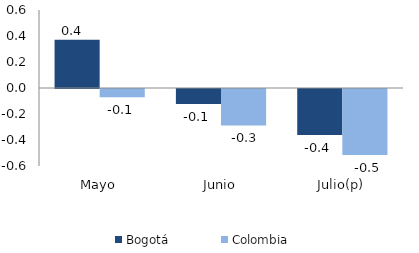
| Category | Bogotá | Colombia |
|---|---|---|
| Mayo | 0.371 | -0.063 |
| Junio | -0.116 | -0.28 |
| Julio(p) | -0.353 | -0.507 |